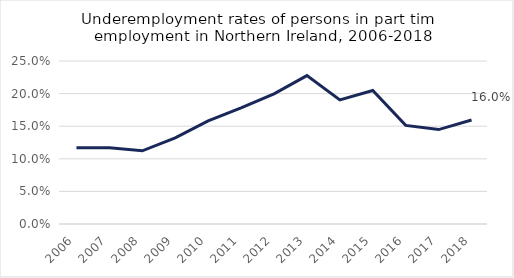
| Category | Underemployment Rate |
|---|---|
| 2006 | 0.117 |
| 2007 | 0.117 |
| 2008 | 0.112 |
| 2009 | 0.132 |
| 2010 | 0.158 |
| 2011 | 0.178 |
| 2012 | 0.2 |
| 2013 | 0.228 |
| 2014 | 0.19 |
| 2015 | 0.205 |
| 2016 | 0.151 |
| 2017 | 0.145 |
| 2018 | 0.16 |